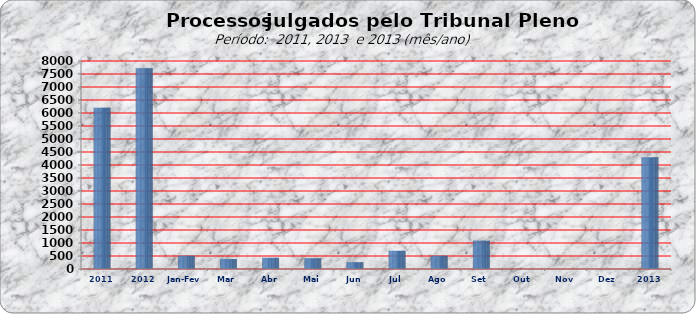
| Category | 6205 7722 509 381 429 411 264 701 508 1091 0 0 0 |
|---|---|
| 2011 | 6205 |
| 2012 | 7722 |
| Jan-Fev | 509 |
| Mar | 381 |
| Abr | 429 |
| Mai | 411 |
| Jun | 264 |
| Jul | 701 |
| Ago | 508 |
| Set | 1091 |
| Out | 0 |
| Nov | 0 |
| Dez | 0 |
| 2013 | 4294 |